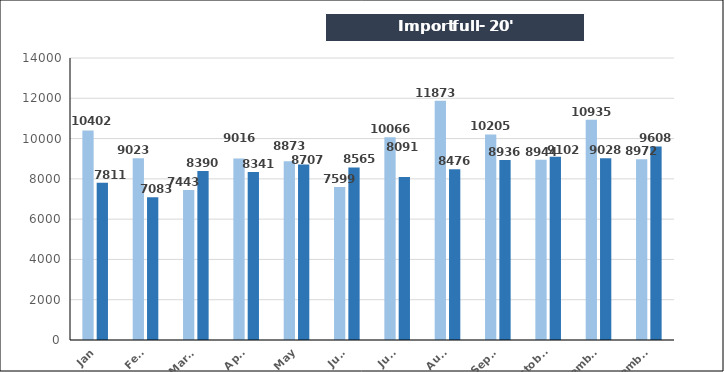
| Category | Import full - 20' |
|---|---|
| Jan | 7811 |
| Feb. | 7083 |
| March | 8390 |
| April | 8341 |
| May | 8707 |
| June | 8565 |
| July | 8091 |
| Aug. | 8476 |
| Sept. | 8936 |
| October | 9102 |
| November | 9028 |
| December | 9608 |